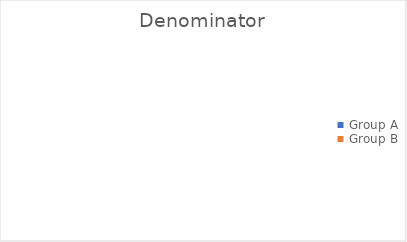
| Category |  Denominator  |
|---|---|
| Group A | 0 |
| Group B | 0 |